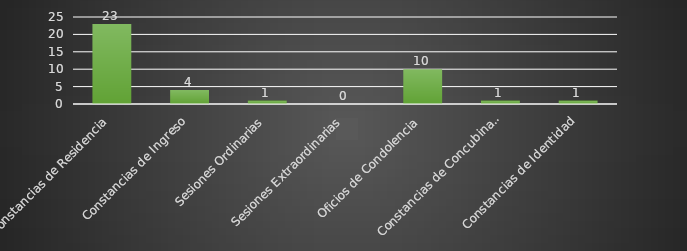
| Category | INDICADOR  |
|---|---|
| Constancias de Residencia | 23 |
| Constancias de Ingreso | 4 |
| Sesiones Ordinarias | 1 |
| Sesiones Extraordinarias | 0 |
| Oficios de Condolencia | 10 |
| Constancias de Concubinato | 1 |
| Constancias de Identidad | 1 |